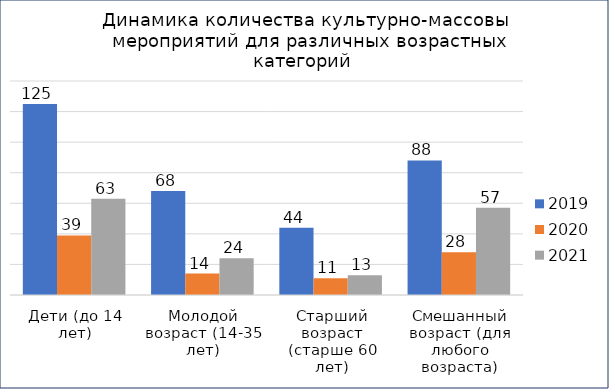
| Category | 2019 | 2020 | 2021 |
|---|---|---|---|
| Дети (до 14 лет) | 125 | 39 | 63 |
| Молодой возраст (14-35 лет) | 68 | 14 | 24 |
| Старший возраст (старше 60 лет) | 44 | 11 | 13 |
| Смешанный возраст (для любого возраста) | 88 | 28 | 57 |